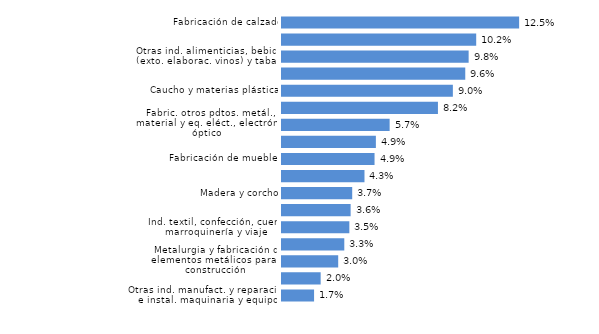
| Category | La Rioja |
|---|---|
| Otras ind. manufact. y reparación e instal. maquinaria y equipo | 0.017 |
| Industria química y farmacéutica | 0.02 |
| Metalurgia y fabricación de elementos metálicos para la construcción | 0.03 |
| Forja y talleres | 0.033 |
| Ind. textil, confección, cuero, marroquinería y viaje | 0.035 |
| Papel, artes gráficas y reproducción de soportes grabados | 0.036 |
| Madera y corcho | 0.037 |
| Productos minerales no metálicos diversos | 0.043 |
| Fabricación de muebles | 0.049 |
| Industrias extractivas, energía, agua y residuos | 0.049 |
| Fabric. otros pdtos. metál., material y eq. eléct., electrón. y óptico | 0.057 |
| Fabricación de maquinaria, equipo y material de transporte | 0.082 |
| Caucho y materias plásticas | 0.09 |
| Ind. cárnica, frutas, hortal., aceit. y grasas veget. y anim. e ind. láctea | 0.096 |
| Otras ind. alimenticias, bebidas (exto. elaborac. vinos) y tabaco | 0.098 |
| Elaboración de vinos | 0.102 |
| Fabricación de calzado | 0.125 |